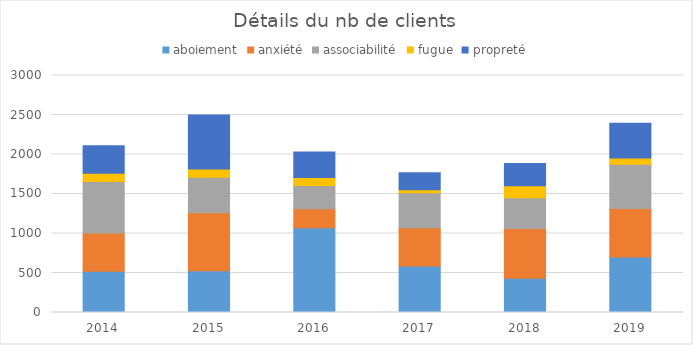
| Category | aboiement | anxiété | associabilité | fugue | propreté |
|---|---|---|---|---|---|
| 2014 | 523 | 484 | 651 | 104 | 348 |
| 2015 | 527 | 737 | 448 | 104 | 685 |
| 2016 | 1073 | 241 | 294 | 100 | 323 |
| 2017 | 590 | 482 | 444 | 37 | 216 |
| 2018 | 434 | 630 | 387 | 152 | 284 |
| 2019 | 701 | 616 | 560 | 80 | 437 |